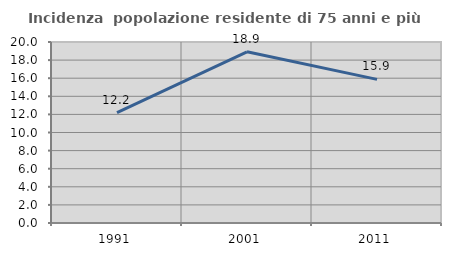
| Category | Incidenza  popolazione residente di 75 anni e più |
|---|---|
| 1991.0 | 12.188 |
| 2001.0 | 18.919 |
| 2011.0 | 15.873 |